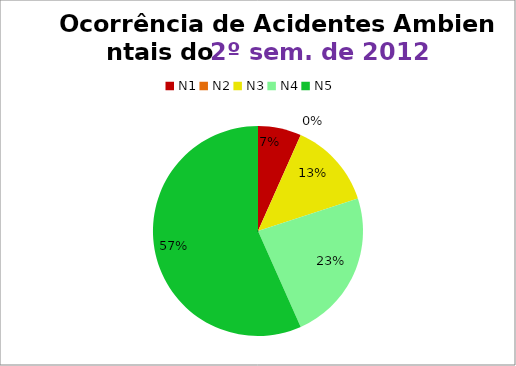
| Category | 2º/12 |
|---|---|
| N1 | 2 |
| N2 | 0 |
| N3 | 4 |
| N4 | 7 |
| N5 | 17 |